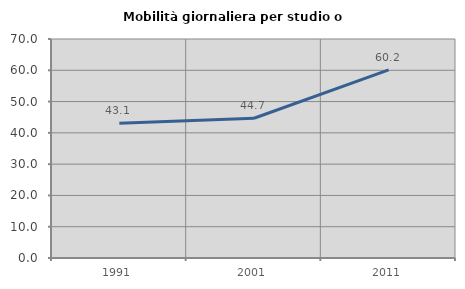
| Category | Mobilità giornaliera per studio o lavoro |
|---|---|
| 1991.0 | 43.066 |
| 2001.0 | 44.667 |
| 2011.0 | 60.156 |